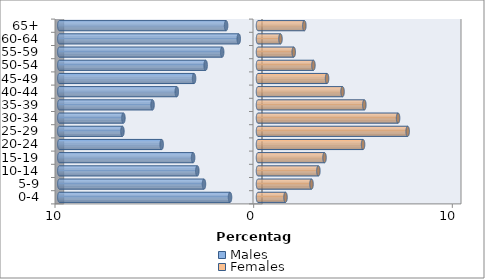
| Category | Males | Females |
|---|---|---|
| 0-4 | -1.408 | 1.385 |
| 5-9 | -2.72 | 2.694 |
| 10-14 | -3.054 | 3.04 |
| 15-19 | -3.267 | 3.348 |
| 20-24 | -4.849 | 5.288 |
| 25-29 | -6.824 | 7.534 |
| 30-34 | -6.775 | 7.051 |
| 35-39 | -5.309 | 5.352 |
| 40-44 | -4.087 | 4.256 |
| 45-49 | -3.217 | 3.476 |
| 50-54 | -2.635 | 2.79 |
| 55-59 | -1.804 | 1.798 |
| 60-64 | -0.969 | 1.132 |
| 65+ | -1.606 | 2.333 |